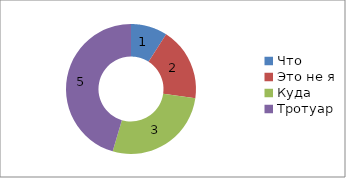
| Category | Series 0 |
|---|---|
| Что | 1 |
| Это не я | 2 |
| Куда | 3 |
| Тротуар | 5 |